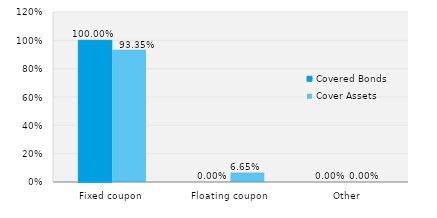
| Category | Covered Bonds | Cover Assets |
|---|---|---|
| Fixed coupon | 1 | 0.934 |
| Floating coupon | 0 | 0.066 |
| Other | 0 | 0 |